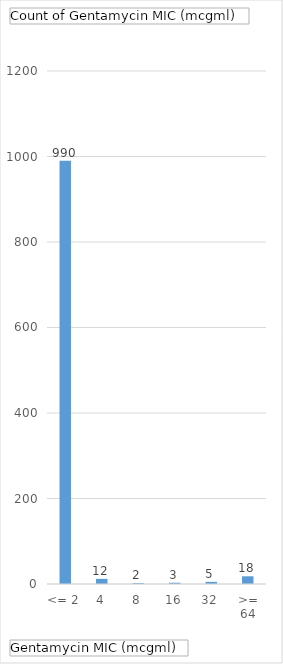
| Category | Total |
|---|---|
| <= 2 | 990 |
| 4 | 12 |
| 8 | 2 |
| 16 | 3 |
| 32 | 5 |
| >= 64 | 18 |